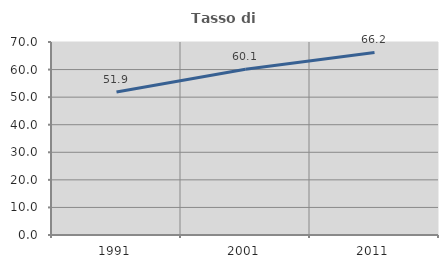
| Category | Tasso di occupazione   |
|---|---|
| 1991.0 | 51.883 |
| 2001.0 | 60.084 |
| 2011.0 | 66.216 |